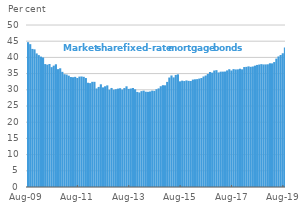
| Category | Markedsandel |
|---|---|
| 2009-08-01 | 44.699 |
| 2009-09-01 | 44.081 |
| 2009-10-01 | 42.616 |
| 2009-11-01 | 42.484 |
| 2009-12-01 | 41.227 |
| 2010-01-01 | 40.705 |
| 2010-02-01 | 40.247 |
| 2010-03-01 | 39.976 |
| 2010-04-01 | 37.942 |
| 2010-05-01 | 37.762 |
| 2010-06-01 | 37.97 |
| 2010-07-01 | 36.988 |
| 2010-08-01 | 37.458 |
| 2010-09-01 | 37.882 |
| 2010-10-01 | 36.376 |
| 2010-11-01 | 36.638 |
| 2010-12-01 | 35.545 |
| 2011-01-01 | 34.817 |
| 2011-02-01 | 34.705 |
| 2011-03-01 | 34.353 |
| 2011-04-01 | 33.94 |
| 2011-05-01 | 33.876 |
| 2011-06-01 | 33.998 |
| 2011-07-01 | 33.636 |
| 2011-08-01 | 34.073 |
| 2011-09-01 | 34.106 |
| 2011-10-01 | 34.005 |
| 2011-11-01 | 33.633 |
| 2011-12-01 | 32.177 |
| 2012-01-01 | 32.057 |
| 2012-02-01 | 32.463 |
| 2012-03-01 | 32.46 |
| 2012-04-01 | 30.417 |
| 2012-05-01 | 30.888 |
| 2012-06-01 | 31.701 |
| 2012-07-01 | 30.749 |
| 2012-08-01 | 31.086 |
| 2012-09-01 | 31.365 |
| 2012-10-01 | 30.032 |
| 2012-11-01 | 30.57 |
| 2012-12-01 | 30.02 |
| 2013-01-01 | 30.185 |
| 2013-02-01 | 30.368 |
| 2013-03-01 | 30.487 |
| 2013-04-01 | 30.079 |
| 2013-05-01 | 30.541 |
| 2013-06-01 | 31.078 |
| 2013-07-01 | 30.276 |
| 2013-08-01 | 30.396 |
| 2013-09-01 | 30.564 |
| 2013-10-01 | 30.161 |
| 2013-11-01 | 29.355 |
| 2013-12-01 | 29.188 |
| 2014-01-01 | 29.592 |
| 2014-02-01 | 29.731 |
| 2014-03-01 | 29.416 |
| 2014-04-01 | 29.385 |
| 2014-05-01 | 29.49 |
| 2014-06-01 | 29.743 |
| 2014-07-01 | 29.663 |
| 2014-08-01 | 30.183 |
| 2014-09-01 | 30.44 |
| 2014-10-01 | 31.104 |
| 2014-11-01 | 31.422 |
| 2014-12-01 | 31.386 |
| 2015-01-01 | 32.44 |
| 2015-02-01 | 33.785 |
| 2015-03-01 | 34.42 |
| 2015-04-01 | 33.823 |
| 2015-05-01 | 34.586 |
| 2015-06-01 | 34.776 |
| 2015-07-01 | 32.613 |
| 2015-08-01 | 32.823 |
| 2015-09-01 | 32.704 |
| 2015-10-01 | 32.89 |
| 2015-11-01 | 32.761 |
| 2015-12-01 | 32.722 |
| 2016-01-01 | 33.149 |
| 2016-02-01 | 33.242 |
| 2016-03-01 | 33.293 |
| 2016-04-01 | 33.467 |
| 2016-05-01 | 33.633 |
| 2016-06-01 | 34.108 |
| 2016-07-01 | 34.407 |
| 2016-08-01 | 34.896 |
| 2016-09-01 | 35.5 |
| 2016-10-01 | 35.3 |
| 2016-11-01 | 35.947 |
| 2016-12-01 | 36.064 |
| 2017-01-01 | 35.359 |
| 2017-02-01 | 35.598 |
| 2017-03-01 | 35.611 |
| 2017-04-01 | 35.638 |
| 2017-05-01 | 35.989 |
| 2017-06-01 | 36.35 |
| 2017-07-01 | 35.959 |
| 2017-08-01 | 36.384 |
| 2017-09-01 | 36.277 |
| 2017-10-01 | 36.312 |
| 2017-11-01 | 36.51 |
| 2017-12-01 | 36.323 |
| 2018-01-01 | 37.024 |
| 2018-02-01 | 37.078 |
| 2018-03-01 | 37.23 |
| 2018-04-01 | 37.089 |
| 2018-05-01 | 37.192 |
| 2018-06-01 | 37.458 |
| 2018-07-01 | 37.676 |
| 2018-08-01 | 37.798 |
| 2018-09-01 | 37.914 |
| 2018-10-01 | 37.824 |
| 2018-11-01 | 37.832 |
| 2018-12-01 | 37.878 |
| 2019-01-01 | 38.183 |
| 2019-02-01 | 38.157 |
| 2019-03-01 | 38.562 |
| 2019-04-01 | 39.617 |
| 2019-05-01 | 40.297 |
| 2019-06-01 | 40.747 |
| 2019-07-01 | 41.28 |
| 2019-08-01 | 43.02 |